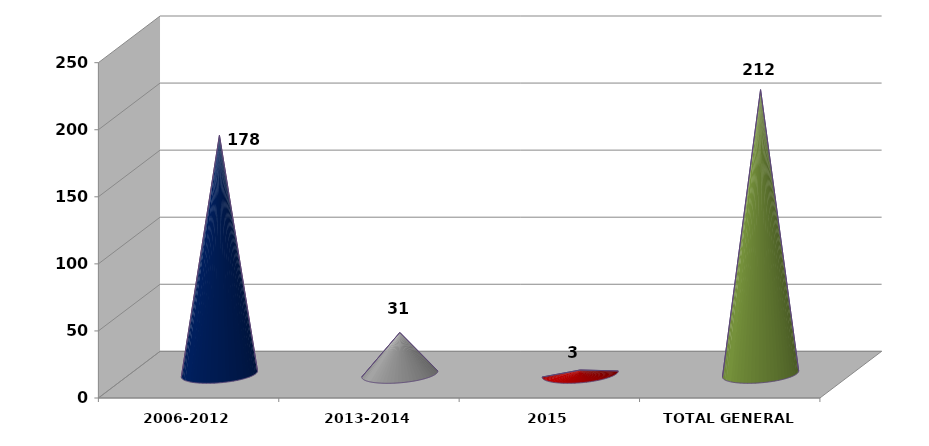
| Category | Series 0 |
|---|---|
| 2006-2012 | 178 |
| 2013-2014 | 31 |
| 2015 | 3 |
| TOTAL GENERAL | 212 |